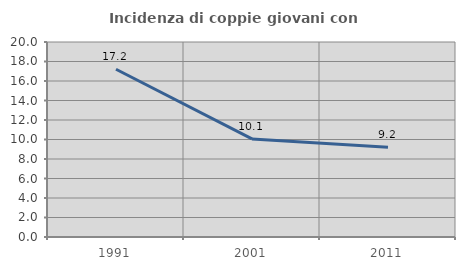
| Category | Incidenza di coppie giovani con figli |
|---|---|
| 1991.0 | 17.202 |
| 2001.0 | 10.062 |
| 2011.0 | 9.195 |